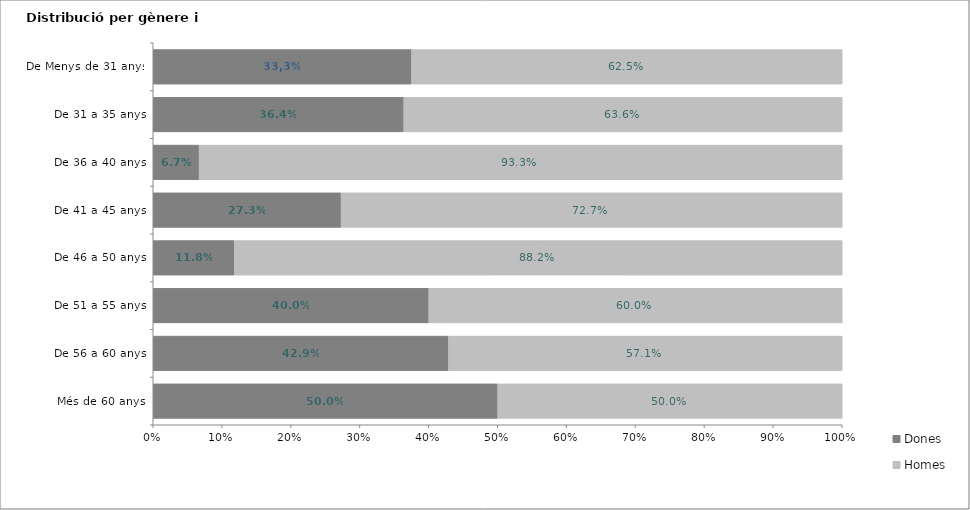
| Category | Dones | Homes |
|---|---|---|
| Més de 60 anys | 0.5 | 0.5 |
| De 56 a 60 anys | 0.429 | 0.571 |
| De 51 a 55 anys | 0.4 | 0.6 |
| De 46 a 50 anys | 0.118 | 0.882 |
| De 41 a 45 anys | 0.273 | 0.727 |
| De 36 a 40 anys | 0.067 | 0.933 |
| De 31 a 35 anys | 0.364 | 0.636 |
| De Menys de 31 anys | 0.375 | 0.625 |